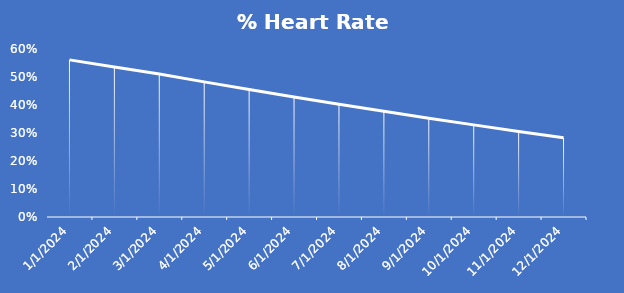
| Category | % Heart Rate Reserve |
|---|---|
| 1/2/24 | 0.561 |
| 2/2/24 | 0.536 |
| 3/2/24 | 0.511 |
| 4/2/24 | 0.483 |
| 5/2/24 | 0.455 |
| 6/2/24 | 0.429 |
| 7/2/24 | 0.403 |
| 8/2/24 | 0.377 |
| 9/2/24 | 0.353 |
| 10/2/24 | 0.329 |
| 11/2/24 | 0.306 |
| 12/2/24 | 0.283 |